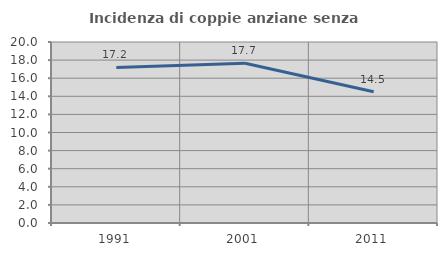
| Category | Incidenza di coppie anziane senza figli  |
|---|---|
| 1991.0 | 17.19 |
| 2001.0 | 17.656 |
| 2011.0 | 14.51 |